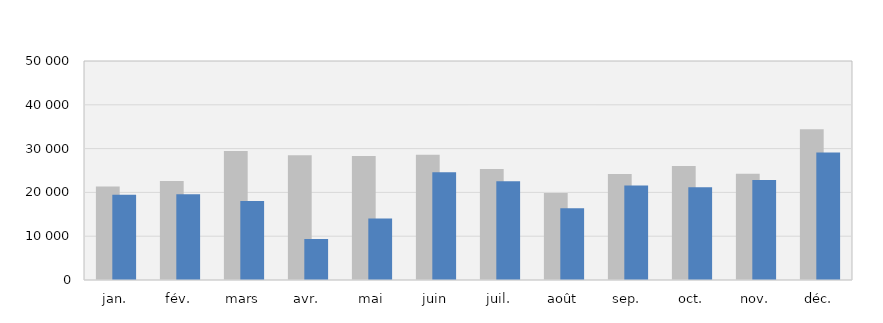
| Category | 2019 | 2020 |
|---|---|---|
| jan. | 21336 | 19458 |
| fév. | 22609 | 19571 |
| mars | 29458 | 18032 |
| avr. | 28461 | 9343 |
| mai | 28339 | 14040 |
| juin | 28600 | 24593 |
| juil. | 25319 | 22537 |
| août | 19882 | 16381 |
| sep. | 24221 | 21581 |
| oct. | 26015 | 21148 |
| nov. | 24243 | 22851 |
| déc. | 34419 | 29129 |